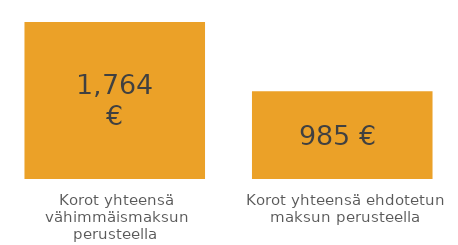
| Category | Series 0 |
|---|---|
| Korot yhteensä vähimmäismaksun perusteella | 1763.952 |
| Korot yhteensä ehdotetun maksun perusteella | 984.811 |